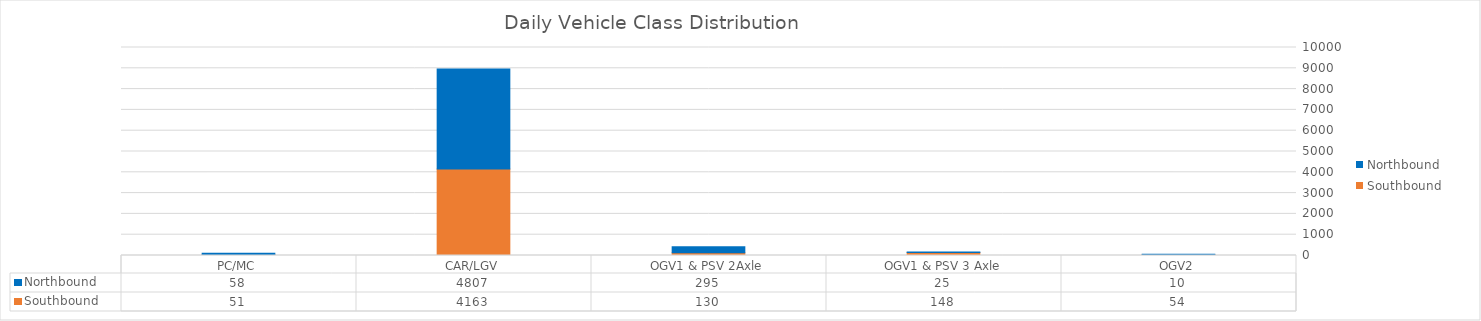
| Category | Southbound | Northbound |
|---|---|---|
| PC/MC | 51 | 58 |
| CAR/LGV | 4163 | 4807 |
| OGV1 & PSV 2Axle | 130 | 295 |
| OGV1 & PSV 3 Axle | 148 | 25 |
| OGV2 | 54 | 10 |